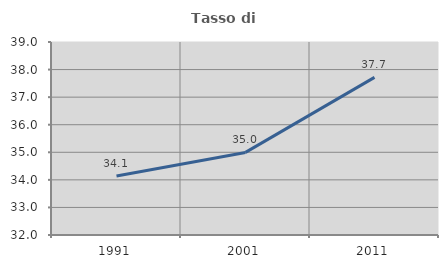
| Category | Tasso di occupazione   |
|---|---|
| 1991.0 | 34.143 |
| 2001.0 | 34.996 |
| 2011.0 | 37.717 |